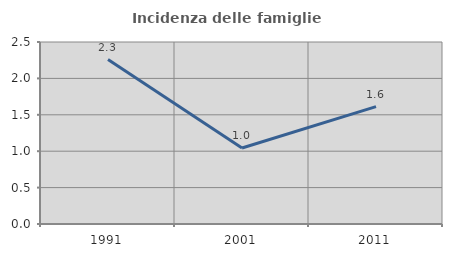
| Category | Incidenza delle famiglie numerose |
|---|---|
| 1991.0 | 2.258 |
| 2001.0 | 1.044 |
| 2011.0 | 1.613 |